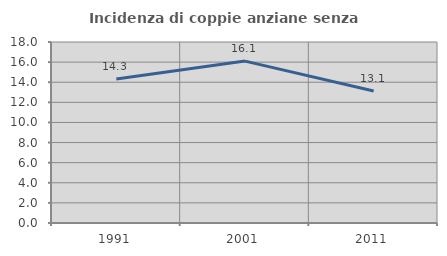
| Category | Incidenza di coppie anziane senza figli  |
|---|---|
| 1991.0 | 14.321 |
| 2001.0 | 16.102 |
| 2011.0 | 13.124 |